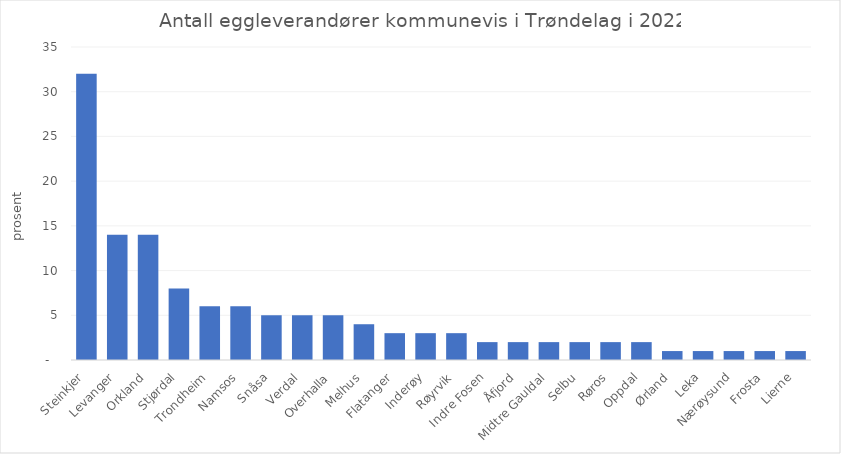
| Category | Totalt |
|---|---|
| Steinkjer | 32 |
| Levanger | 14 |
| Orkland | 14 |
| Stjørdal | 8 |
| Trondheim | 6 |
| Namsos | 6 |
| Snåsa | 5 |
| Verdal | 5 |
| Overhalla | 5 |
| Melhus | 4 |
| Flatanger | 3 |
| Inderøy | 3 |
| Røyrvik | 3 |
| Indre Fosen | 2 |
| Åfjord | 2 |
| Midtre Gauldal | 2 |
| Selbu | 2 |
| Røros | 2 |
| Oppdal | 2 |
| Ørland | 1 |
| Leka | 1 |
| Nærøysund | 1 |
| Frosta | 1 |
| Lierne | 1 |